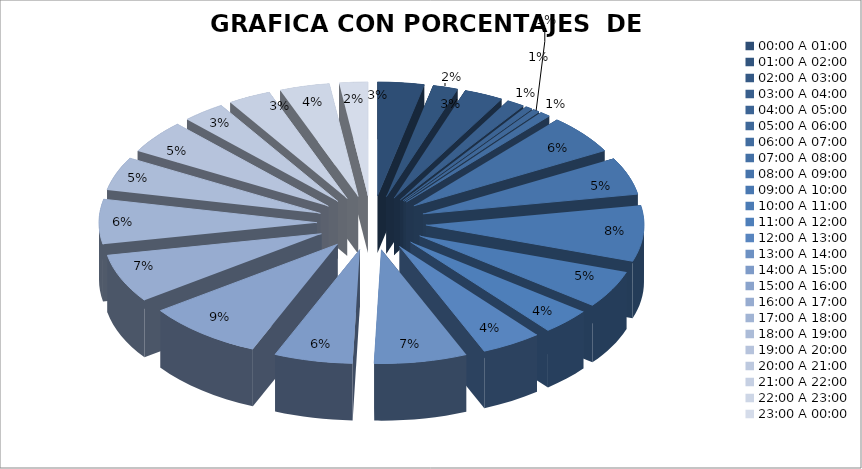
| Category | COMPUTO |
|---|---|
| 00:00 A 01:00 | 13 |
| 01:00 A 02:00 | 7 |
| 02:00 A 03:00 | 11 |
| 03:00 A 04:00 | 5 |
| 04:00 A 05:00 | 2 |
| 05:00 A 06:00 | 2 |
| 06:00 A 07:00 | 3 |
| 07:00 A 08:00 | 21 |
| 08:00 A 09:00 | 20 |
| 09:00 A 10:00 | 30 |
| 10:00 A 11:00 | 20 |
| 11:00 A 12:00 | 14 |
| 12:00 A 13:00 | 17 |
| 13:00 A 14:00 | 26 |
| 14:00 A 15:00 | 22 |
| 15:00 A 16:00 | 33 |
| 16:00 A 17:00 | 26 |
| 17:00 A 18:00 | 24 |
| 18:00 A 19:00 | 18 |
| 19:00 A 20:00 | 18 |
| 20:00 A 21:00 | 12 |
| 21:00 A 22:00 | 12 |
| 22:00 A 23:00 | 14 |
| 23:00 A 00:00 | 8 |